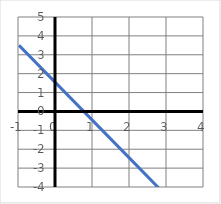
| Category | Series 0 |
|---|---|
| -1.0 | 3.5 |
| 0.0 | 1.5 |
| 1.0 | -0.5 |
| 2.0 | -2.5 |
| 3.0 | -4.5 |
| 4.0 | -6.5 |